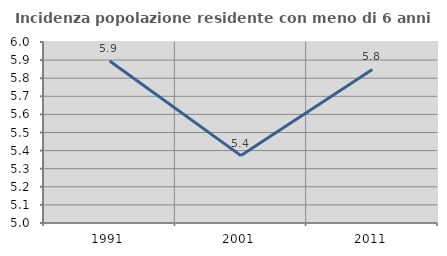
| Category | Incidenza popolazione residente con meno di 6 anni |
|---|---|
| 1991.0 | 5.895 |
| 2001.0 | 5.372 |
| 2011.0 | 5.848 |